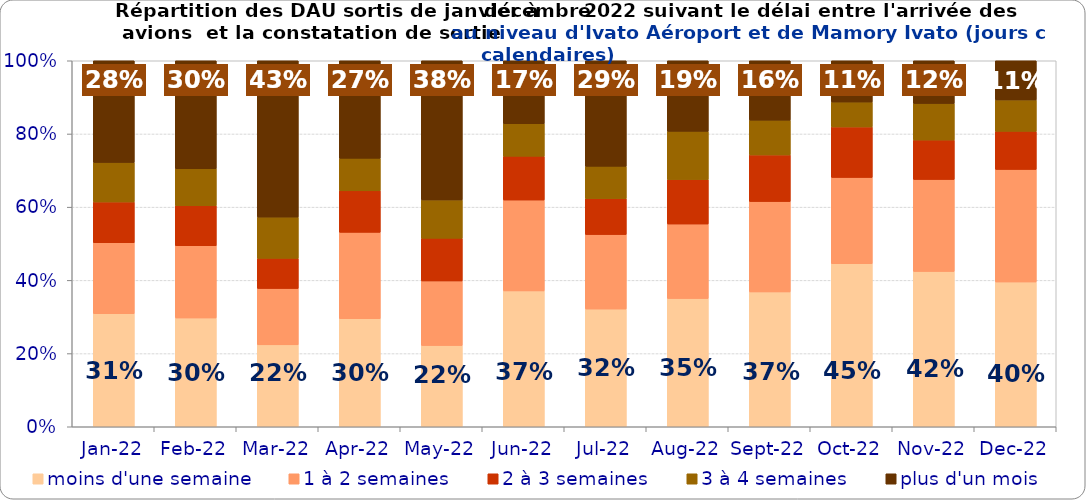
| Category | moins d'une semaine | 1 à 2 semaines | 2 à 3 semaines | 3 à 4 semaines | plus d'un mois |
|---|---|---|---|---|---|
| 2022-01-01 | 0.309 | 0.194 | 0.112 | 0.108 | 0.278 |
| 2022-02-01 | 0.297 | 0.197 | 0.109 | 0.101 | 0.295 |
| 2022-03-01 | 0.224 | 0.154 | 0.082 | 0.113 | 0.427 |
| 2022-04-01 | 0.295 | 0.236 | 0.114 | 0.089 | 0.266 |
| 2022-05-01 | 0.222 | 0.177 | 0.117 | 0.105 | 0.38 |
| 2022-06-01 | 0.371 | 0.248 | 0.12 | 0.089 | 0.172 |
| 2022-07-01 | 0.322 | 0.204 | 0.098 | 0.088 | 0.288 |
| 2022-08-01 | 0.35 | 0.204 | 0.122 | 0.132 | 0.193 |
| 2022-09-01 | 0.368 | 0.247 | 0.127 | 0.095 | 0.162 |
| 2022-10-01 | 0.445 | 0.236 | 0.138 | 0.068 | 0.113 |
| 2022-11-01 | 0.424 | 0.251 | 0.108 | 0.1 | 0.117 |
| 2022-12-01 | 0.396 | 0.308 | 0.104 | 0.086 | 0.107 |